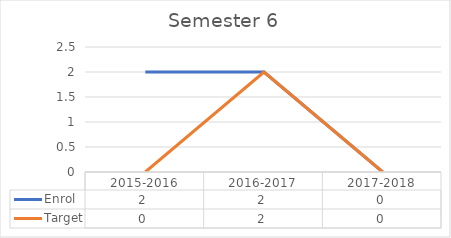
| Category | Enrol | Target |
|---|---|---|
| 2015-2016 | 2 | 0 |
| 2016-2017 | 2 | 2 |
| 2017-2018 | 0 | 0 |